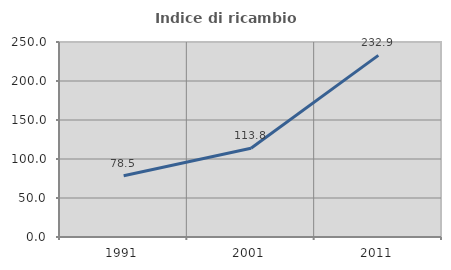
| Category | Indice di ricambio occupazionale  |
|---|---|
| 1991.0 | 78.531 |
| 2001.0 | 113.757 |
| 2011.0 | 232.87 |